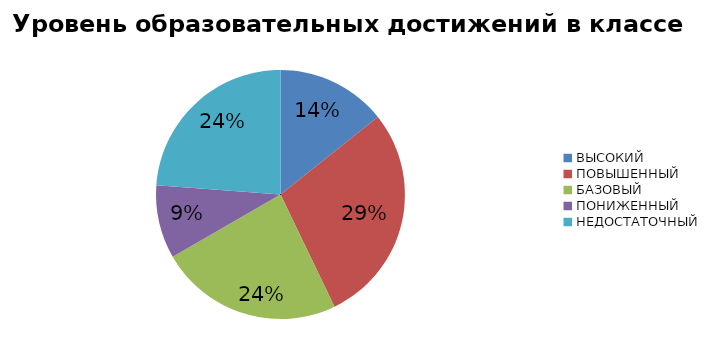
| Category | Series 0 |
|---|---|
| ВЫСОКИЙ | 14.286 |
| ПОВЫШЕННЫЙ | 28.571 |
| БАЗОВЫЙ | 23.81 |
| ПОНИЖЕННЫЙ | 9.524 |
| НЕДОСТАТОЧНЫЙ | 23.81 |